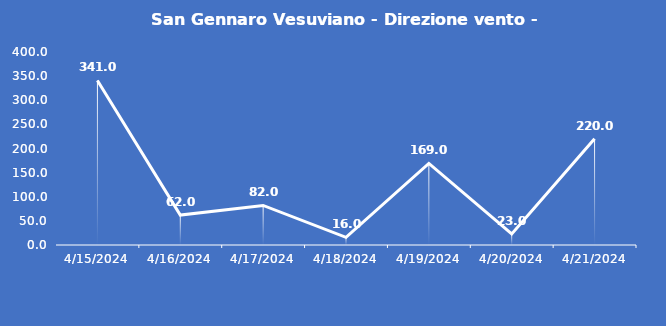
| Category | San Gennaro Vesuviano - Direzione vento - Grezzo (°N) |
|---|---|
| 4/15/24 | 341 |
| 4/16/24 | 62 |
| 4/17/24 | 82 |
| 4/18/24 | 16 |
| 4/19/24 | 169 |
| 4/20/24 | 23 |
| 4/21/24 | 220 |